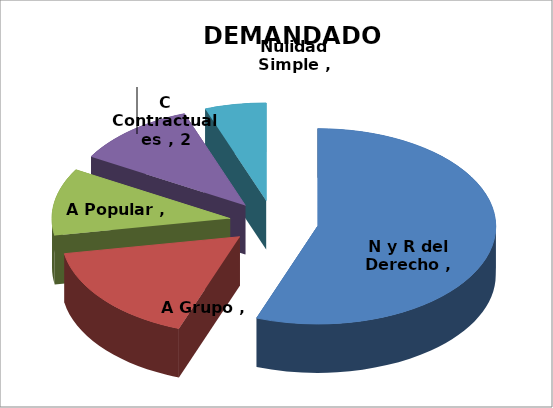
| Category | Series 0 |
|---|---|
| N y R del Derecho  | 10 |
| A Grupo  | 3 |
| A Popular  | 2 |
| C Contractuales  | 2 |
| Nulidad Simple  | 1 |